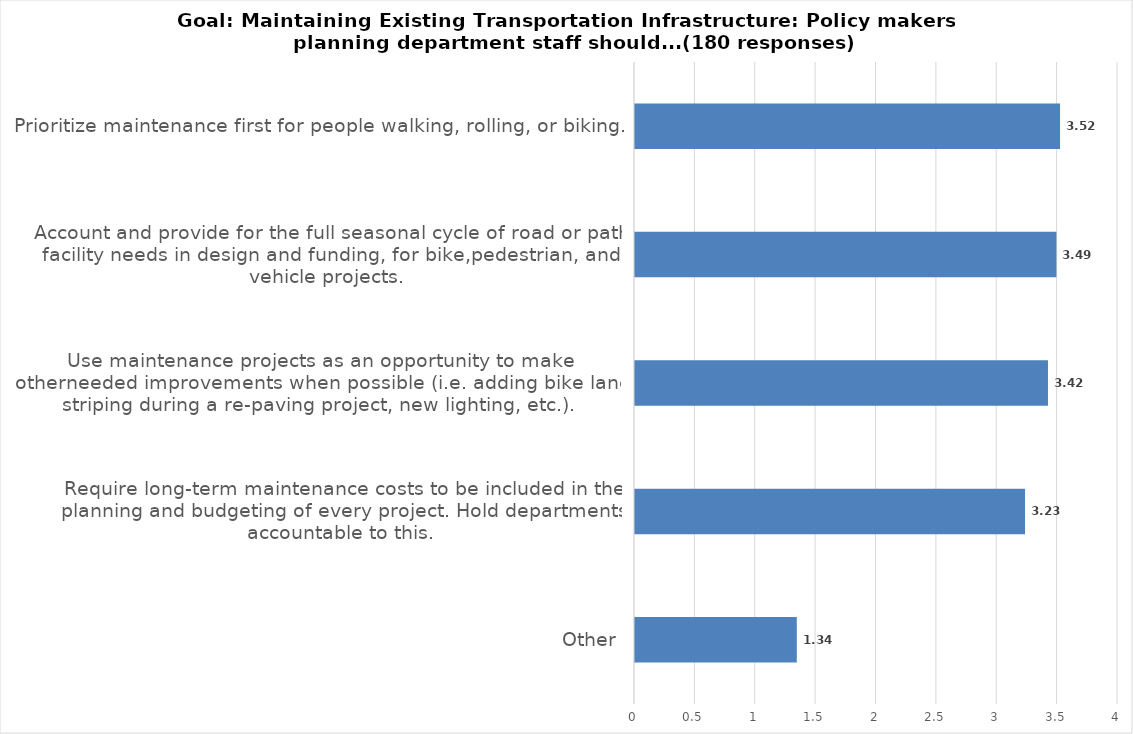
| Category | Score (all choices weighted) |
|---|---|
| Other | 1.34 |
| Require long-term maintenance costs to be included in the planning and budgeting of every project. Hold departments accountable to this. | 3.23 |
| Use maintenance projects as an opportunity to make otherneeded improvements when possible (i.e. adding bike lane striping during a re-paving project, new lighting, etc.). | 3.42 |
| Account and provide for the full seasonal cycle of road or path facility needs in design and funding, for bike,pedestrian, and vehicle projects. | 3.49 |
| Prioritize maintenance first for people walking, rolling, or biking. | 3.52 |